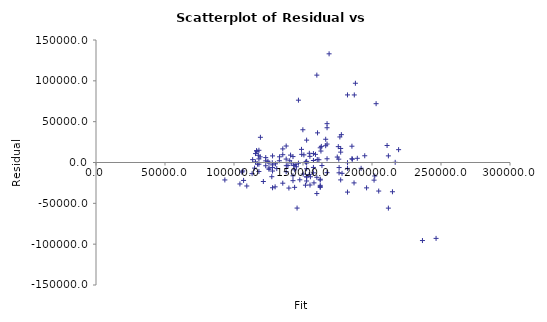
| Category | Series 0 |
|---|---|
| 93369.99130080923 | -21369.991 |
| 115588.62127844186 | 711.379 |
| 152619.67124116293 | -619.671 |
| 109268.65541813747 | -28768.655 |
| 160025.88123370713 | -18125.881 |
| 151780.30077534125 | -27780.301 |
| 113514.88248052949 | 3485.118 |
| 154594.66057250806 | 11305.339 |
| 246431.66448005626 | -92931.664 |
| 117662.36007635425 | 8837.64 |
| 160025.88123370713 | -38025.881 |
| 133017.9021275626 | 6982.098 |
| 146694.70324712756 | 76305.297 |
| 113119.88461426046 | -13619.885 |
| 177800.78521581326 | 34099.215 |
| 127932.30459934889 | -6032.305 |
| 159038.3865680346 | 9961.613 |
| 211869.35118151663 | -55869.351 |
| 130993.53806293383 | -7493.538 |
| 150150.93457698153 | -14150.935 |
| 166444.5965605788 | 28455.403 |
| 130104.79286382852 | -1604.793 |
| 168913.3332247602 | 133086.667 |
| 137807.25125607452 | 4192.749 |
| 182244.51121133976 | -36244.511 |
| 175924.54535103537 | 4075.455 |
| 115588.62127844186 | 10911.379 |
| 143238.4719172736 | -3738.472 |
| 125364.81846860022 | -464.818 |
| 162494.61789788853 | -29494.618 |
| 135338.5145918931 | -25338.515 |
| 125364.81846860022 | -6864.818 |
| 189354.4728041822 | 5145.527 |
| 187181.9845397026 | 82718.015 |
| 204858.13905524142 | -34958.139 |
| 149904.0609105634 | 40095.939 |
| 194736.3187320977 | 8263.681 |
| 135338.5145918931 | 9561.485 |
| 105713.67462171626 | -11713.675 |
| 154545.2858392244 | -14645.286 |
| 163284.61363042658 | 19715.386 |
| 143979.092916528 | -8979.093 |
| 162494.61789788853 | -30494.618 |
| 174838.30121879556 | 6661.699 |
| 127932.30459934889 | 8067.695 |
| 160322.1296334089 | 3677.87 |
| 186984.48560656805 | -24984.486 |
| 141510.3562523466 | -510.356 |
| 160519.6285665434 | 36280.371 |
| 122994.83127098608 | 2005.169 |
| 127734.80566621438 | -234.806 |
| 160025.88123370713 | 106974.119 |
| 187971.98027224065 | 97028.02 |
| 116378.61701097991 | 14621.383 |
| 176122.04428416988 | -12622.044 |
| 157952.14243579475 | -24952.142 |
| 119143.6020748631 | 30856.398 |
| 236556.71782333066 | -95556.718 |
| 118057.35794262328 | 14942.642 |
| 177307.03788297696 | 12692.962 |
| 118946.10314172858 | 6953.897 |
| 185404.49414149197 | 4495.506 |
| 167432.09122625133 | -12432.091 |
| 140374.73738682317 | 2125.263 |
| 155384.6563050461 | -17484.656 |
| 152619.67124116293 | -22619.671 |
| 125364.81846860022 | -8364.818 |
| 162494.61789788853 | 18005.382 |
| 154989.65843877709 | 7510.342 |
| 114897.37501247108 | -6897.375 |
| 176171.4190174535 | -6171.419 |
| 177307.03788297696 | -21307.038 |
| 166444.5965605788 | 20555.403 |
| 142744.72458443732 | 7255.275 |
| 196069.43653075563 | -31069.437 |
| 122994.83127098608 | -3994.831 |
| 139090.99432144884 | -3590.994 |
| 146694.70324712756 | -794.703 |
| 124574.82273606218 | 1425.177 |
| 185453.8688747756 | 19952.131 |
| 201994.404524791 | -16494.405 |
| 175578.92221805 | 19421.078 |
| 127932.30459934889 | -2932.305 |
| 157557.14456952573 | 2442.855 |
| 106404.92088768704 | -10404.921 |
| 162494.61789788853 | -20494.618 |
| 152619.67124116293 | -7619.671 |
| 157557.14456952573 | -6057.145 |
| 140967.2341862267 | 9032.766 |
| 182244.51121133976 | 82755.489 |
| 118057.35794262328 | -2057.358 |
| 152619.67124116293 | -17619.671 |
| 122994.83127098608 | 6005.169 |
| 139782.24058741963 | -31282.241 |
| 161507.123232216 | 3392.877 |
| 127389.18253322897 | -17389.183 |
| 152619.67124116293 | 1380.329 |
| 137906.00072264177 | -3906.001 |
| 163728.98622997926 | -3728.986 |
| 211869.35118151663 | 8130.649 |
| 137807.25125607452 | -11307.251 |
| 142744.72458443732 | -16244.725 |
| 137807.25125607452 | 20192.749 |
| 167432.09122625133 | 4567.909 |
| 167432.09122625133 | 47567.909 |
| 144324.7160495134 | -2424.716 |
| 145707.208581455 | -55807.209 |
| 116576.11594411443 | 13323.884 |
| 132869.7779277117 | 2130.222 |
| 152619.67124116293 | -17619.671 |
| 118057.35794262328 | 4442.642 |
| 219275.56117406083 | 15724.439 |
| 162494.61789788853 | -27994.618 |
| 147682.19791280013 | -21182.198 |
| 152619.67124116293 | 27380.329 |
| 155088.40790534433 | -27588.408 |
| 178294.53254864953 | -13294.533 |
| 127932.30459934889 | -30932.305 |
| 129808.54446412675 | -29808.544 |
| 176714.54108357342 | 31285.459 |
| 182244.51121133976 | -244.511 |
| 182244.51121133976 | -7244.511 |
| 157557.14456952573 | -12657.145 |
| 162988.36523072483 | 14011.635 |
| 210931.23124912768 | 20818.769 |
| 148916.56624489083 | 16083.434 |
| 104281.80735649104 | -26281.807 |
| 214831.8351785343 | -35831.835 |
| 106948.04295380696 | -21948.043 |
| 150644.6819098178 | 9355.318 |
| 162494.61789788853 | -21494.618 |
| 192119.4578680654 | -7119.458 |
| 143929.7181832444 | -30429.718 |
| 185848.86674104462 | 4151.133 |
| 118057.35794262328 | -11057.358 |
| 216806.82450987943 | 193.175 |
| 177307.03788297696 | 17192.962 |
| 135338.5145918931 | 16661.485 |
| 167432.09122625133 | 42567.909 |
| 145213.46124861873 | -5213.461 |
| 142744.72458443732 | -22244.725 |
| 201500.65719195473 | -21600.657 |
| 151928.42497519212 | 571.575 |
| 149064.6904447417 | 9935.31 |
| 157557.14456952573 | 10942.855 |
| 121266.7156060591 | -23266.716 |
| 127932.30459934889 | -10432.305 |
| 117069.86327695071 | -2069.863 |
| 202981.89919046356 | 72018.101 |
| 167432.09122625133 | 22567.909 |